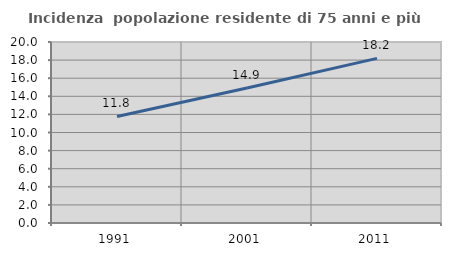
| Category | Incidenza  popolazione residente di 75 anni e più |
|---|---|
| 1991.0 | 11.772 |
| 2001.0 | 14.925 |
| 2011.0 | 18.194 |